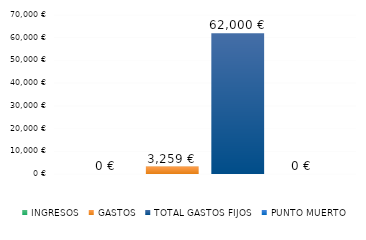
| Category | INGRESOS | GASTOS | TOTAL GASTOS FIJOS | PUNTO MUERTO |
|---|---|---|---|---|
| 0 | 0 | 3258.571 | 62000 | 0 |